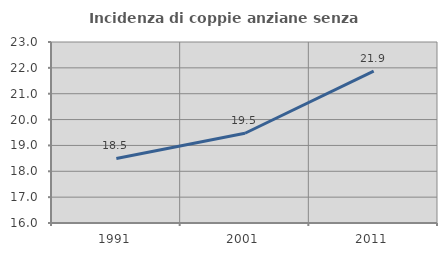
| Category | Incidenza di coppie anziane senza figli  |
|---|---|
| 1991.0 | 18.495 |
| 2001.0 | 19.471 |
| 2011.0 | 21.875 |